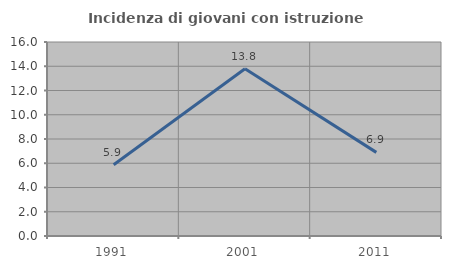
| Category | Incidenza di giovani con istruzione universitaria |
|---|---|
| 1991.0 | 5.882 |
| 2001.0 | 13.793 |
| 2011.0 | 6.897 |